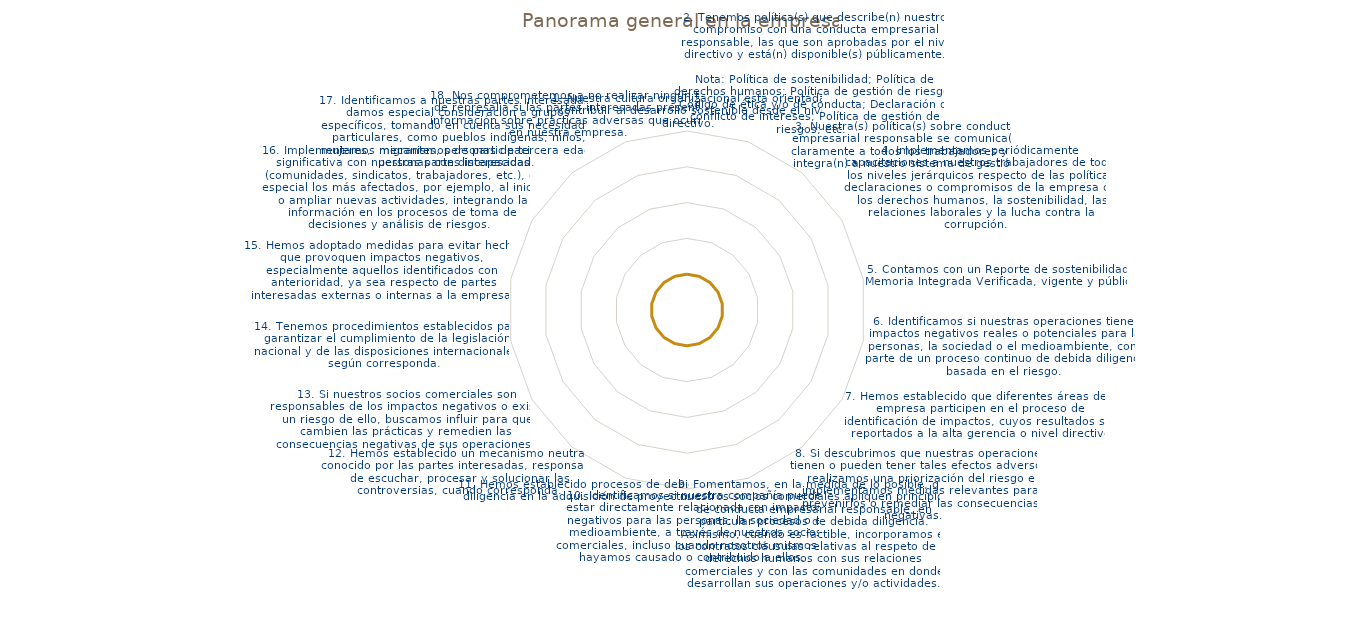
| Category | Panorama general en la empresa |
|---|---|
| 1. Nuestra cultura organizacional está orientada a contribuir al desarrollo sostenible desde el nivel directivo. | 1 |
| 2. Tenemos política(s) que describe(n) nuestro compromiso con una conducta empresarial responsable, las que son aprobadas por el nivel directivo y está(n) disponible(s) públicamente.

Nota: Política de sostenibilidad; Política de derechos humanos; Política | 1 |
| 3. Nuestra(s) política(s) sobre conducta empresarial responsable se comunica(n) claramente a todos los trabajadores y se integra(n) a nuestro sistema de gestión. | 1 |
| 4. Implementamos periódicamente capacitaciones a nuestros trabajadores de todos los niveles jerárquicos respecto de las políticas, declaraciones o compromisos de la empresa con los derechos humanos, la sostenibilidad, las relaciones laborales y la lucha co | 1 |
| 5. Contamos con un Reporte de sostenibilidad o Memoria Integrada Verificada, vigente y pública. | 1 |
| 6. Identificamos si nuestras operaciones tienen impactos negativos reales o potenciales para las personas, la sociedad o el medioambiente, como parte de un proceso continuo de debida diligencia basada en el riesgo. | 1 |
| 7. Hemos establecido que diferentes áreas de la empresa participen en el proceso de identificación de impactos, cuyos resultados son reportados a la alta gerencia o nivel directivo. | 1 |
| 8. Si descubrimos que nuestras operaciones tienen o pueden tener tales efectos adversos, realizamos una priorización del riesgo e implementamos medidas relevantes para prevenirlos o remediar las consecuencias negativas.  | 1 |
| 9. Fomentamos, en la medida de lo posible, que nuestros socios comerciales apliquen principios de conducta empresarial responsable, en particular procesos de debida diligencia. Asimismo, cuando es factible, incorporamos en los contratos cláusulas relativas | 1 |
| 10. Identificamos si nuestra compañía puede estar directamente relacionada con impactos negativos para las personas, la sociedad o el medioambiente, a través de nuestros socios comerciales, incluso cuando nosotros mismos no hayamos causado o contribuido a  | 1 |
| 11. Hemos establecido procesos de debida diligencia en la adquisición de proyectos. | 1 |
| 12. Hemos establecido un mecanismo neutral, conocido por las partes interesadas, responsable de escuchar, procesar y solucionar las controversias, cuando corresponda. | 1 |
| 13. Si nuestros socios comerciales son responsables de los impactos negativos o existe un riesgo de ello, buscamos influir para que cambien las prácticas y remedien las consecuencias negativas de sus operaciones.  | 1 |
| 14. Tenemos procedimientos establecidos para garantizar el cumplimiento de la legislación nacional y de las disposiciones internacionales, según corresponda. | 1 |
| 15. Hemos adoptado medidas para evitar hechos que provoquen impactos negativos, especialmente aquellos identificados con anterioridad, ya sea respecto de partes interesadas externas o internas a la empresa.  | 1 |
| 16. Implementamos mecanismos de participación significativa con nuestras partes interesadas (comunidades, sindicatos, trabajadores, etc.), en especial los más afectados, por ejemplo, al iniciar o ampliar nuevas actividades, integrando la información en los | 1 |
| 17. Identificamos a nuestras partes interesadas y damos especial consideración a grupos específicos, tomando en cuenta sus necesidades particulares, como pueblos indígenas, niños, mujeres,  migrantes, personas de tercera edad y personas con discapacidad. | 1 |
| 18. Nos comprometemos a no realizar ningún tipo de represalia si las partes interesadas presentan información sobre prácticas adversas que ocurren en nuestra empresa. | 1 |